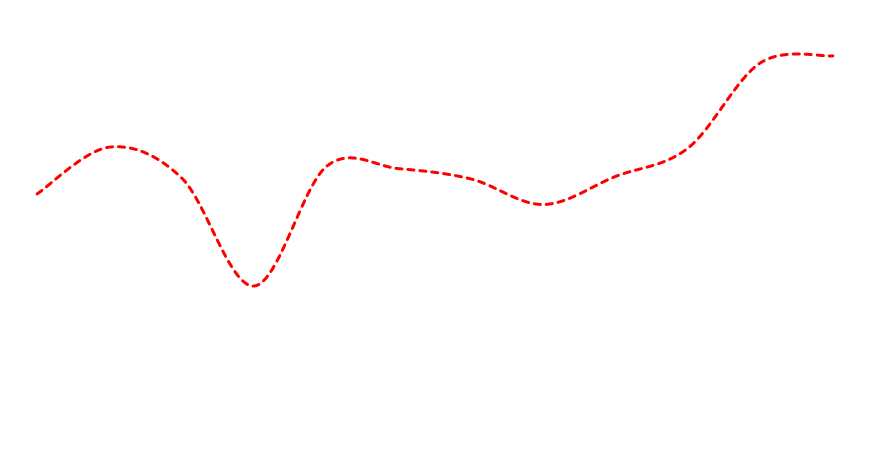
| Category | Series 27 |
|---|---|
| 0 | 18864.696 |
| 1 | 19379.683 |
| 2 | 19037.894 |
| 3 | 17849.867 |
| 4 | 19167.213 |
| 5 | 19142.339 |
| 6 | 19028.529 |
| 7 | 18747.694 |
| 8 | 19057.817 |
| 9 | 19370.504 |
| 10 | 20308.619 |
| 11 | 20384.213 |